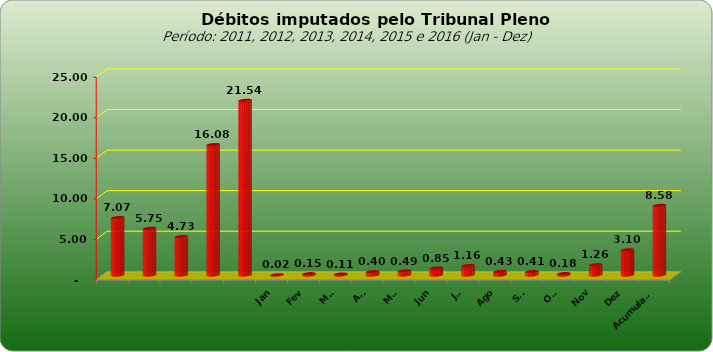
| Category |  7.073.154,74  |
|---|---|
|  | 7073154.74 |
|  | 5749129.25 |
|  | 4727033.51 |
|  | 16081820.48 |
|  | 21535723.6 |
| Jan | 22059.63 |
| Fev | 154318.14 |
| Mar | 112460.95 |
| Abr | 404403.01 |
| Mai | 486409.52 |
| Jun | 852405.84 |
| Jul | 1163444.79 |
| Ago | 426141.81 |
| Set | 412616.73 |
| Out | 176372.2 |
| Nov | 1263376.83 |
| Dez | 3104256.64 |
| Acumulado | 8578266.09 |